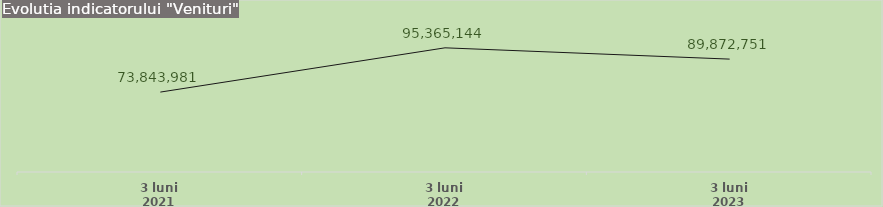
| Category | Series 1 |
|---|---|
| 3 luni 2021 | 73843980.703 |
| 3 luni 2022 | 95365144.089 |
| 3 luni 2023 | 89872750.66 |